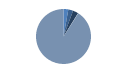
| Category | Series 0 |
|---|---|
| ARRASTRE | 14 |
| CERCO | 14 |
| PALANGRE | 16 |
| REDES DE ENMALLE | 0 |
| ARTES FIJAS | 1 |
| ARTES MENORES | 450 |